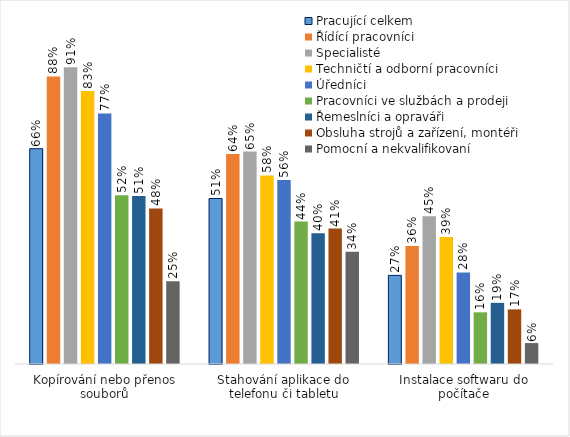
| Category | Pracující celkem | Řídící pracovníci | Specialisté | Techničtí a odborní pracovníci | Úředníci | Pracovníci ve službách a prodeji | Řemeslníci a opraváři | Obsluha strojů a zařízení, montéři | Pomocní a nekvalifikovaní |
|---|---|---|---|---|---|---|---|---|---|
| Kopírování nebo přenos souborů | 0.658 | 0.88 | 0.907 | 0.834 | 0.766 | 0.516 | 0.514 | 0.476 | 0.253 |
| Stahování aplikace do telefonu či tabletu | 0.506 | 0.642 | 0.65 | 0.577 | 0.563 | 0.435 | 0.4 | 0.414 | 0.343 |
| Instalace softwaru do počítače | 0.271 | 0.361 | 0.452 | 0.388 | 0.28 | 0.158 | 0.187 | 0.167 | 0.064 |